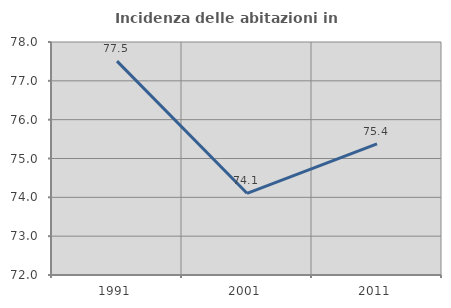
| Category | Incidenza delle abitazioni in proprietà  |
|---|---|
| 1991.0 | 77.508 |
| 2001.0 | 74.103 |
| 2011.0 | 75.378 |